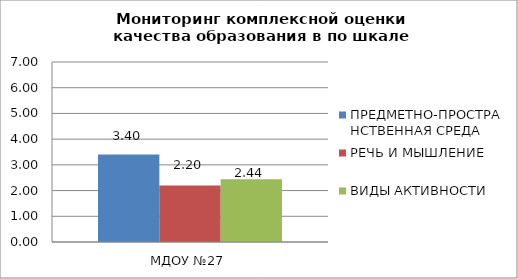
| Category | ПРЕДМЕТНО-ПРОСТРАНСТВЕННАЯ СРЕДА | РЕЧЬ И МЫШЛЕНИЕ | ВИДЫ АКТИВНОСТИ |
|---|---|---|---|
| 0 | 3.4 | 2.2 | 2.44 |